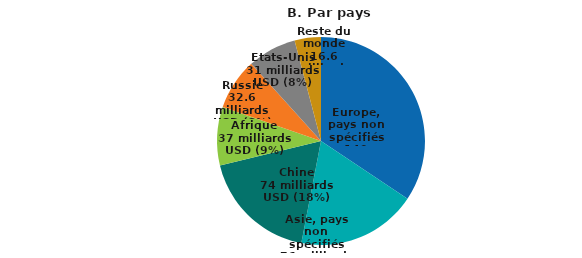
| Category | Series 0 |
|---|---|
| Europe, pays non précisé | 139.957 |
| Asie, pays non précisé | 75.982 |
| Chine | 74.011 |
| Afrique | 37.025 |
| Russie | 32.596 |
| États-Unis | 30.994 |
| Reste du monde | 16.642 |